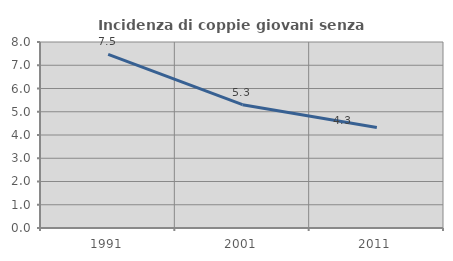
| Category | Incidenza di coppie giovani senza figli |
|---|---|
| 1991.0 | 7.471 |
| 2001.0 | 5.304 |
| 2011.0 | 4.324 |